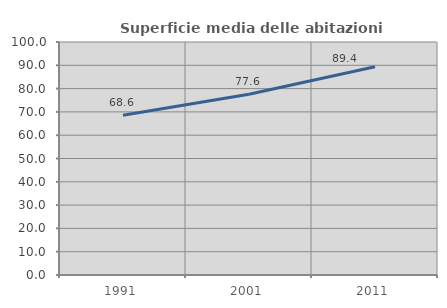
| Category | Superficie media delle abitazioni occupate |
|---|---|
| 1991.0 | 68.558 |
| 2001.0 | 77.571 |
| 2011.0 | 89.364 |